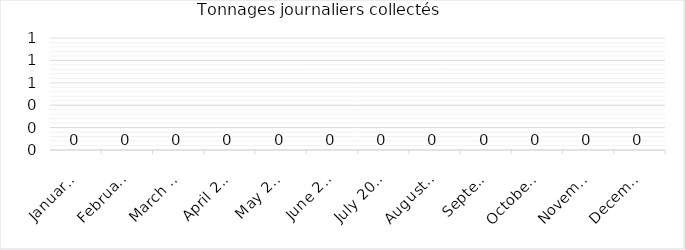
| Category | Series 1 |
|---|---|
| 2020-01-01 | 0 |
| 2020-02-01 | 0 |
| 2020-03-01 | 0 |
| 2020-04-01 | 0 |
| 2020-05-01 | 0 |
| 2020-06-01 | 0 |
| 2020-07-01 | 0 |
| 2020-08-01 | 0 |
| 2020-09-01 | 0 |
| 2020-10-01 | 0 |
| 2020-11-01 | 0 |
| 2020-12-01 | 0 |